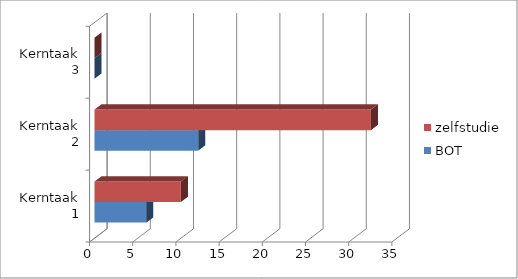
| Category | BOT | zelfstudie |
|---|---|---|
| Kerntaak 1 | 6 | 10 |
| Kerntaak 2 | 12 | 32 |
| Kerntaak 3 | 0 | 0 |